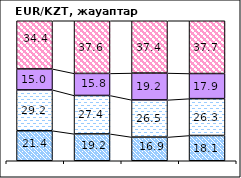
| Category | повысится | не изменится | снизится | не знаю |
|---|---|---|---|---|
| 0 | 21.43 | 29.19 | 14.97 | 34.41 |
| 1 | 19.19 | 27.44 | 15.76 | 37.61 |
| 2 | 16.92 | 26.54 | 19.19 | 37.36 |
| 3 | 18.05 | 26.32 | 17.94 | 37.68 |